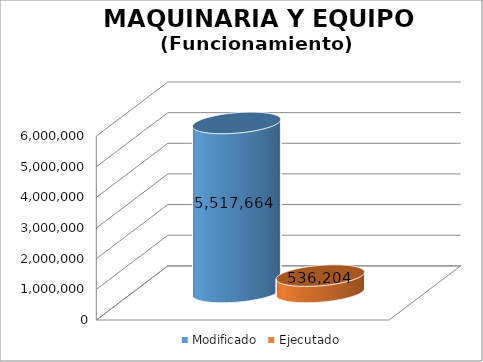
| Category | Modificado | Ejecutado |
|---|---|---|
| 0 | 5517664 | 536203.79 |